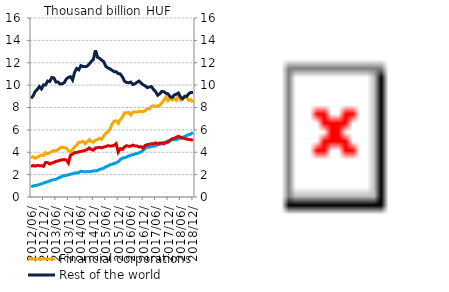
| Category | Financial corporations | Households |
|---|---|---|
| 2012-06-30 | 3.522 | 0.913 |
| 2012-07-31 | 3.581 | 0.984 |
| 2012-08-31 | 3.45 | 1.023 |
| 2012-09-30 | 3.547 | 1.06 |
| 2012-10-31 | 3.66 | 1.107 |
| 2012-11-30 | 3.762 | 1.168 |
| 2012-12-31 | 3.703 | 1.246 |
| 2013-01-31 | 3.965 | 1.311 |
| 2013-02-28 | 3.854 | 1.364 |
| 2013-03-31 | 3.951 | 1.436 |
| 2013-04-30 | 4.077 | 1.516 |
| 2013-05-31 | 4.152 | 1.541 |
| 2013-06-30 | 4.122 | 1.58 |
| 2013-07-31 | 4.225 | 1.681 |
| 2013-08-31 | 4.38 | 1.75 |
| 2013-09-30 | 4.46 | 1.872 |
| 2013-10-31 | 4.414 | 1.893 |
| 2013-11-30 | 4.366 | 1.935 |
| 2013-12-31 | 4.145 | 1.991 |
| 2014-01-31 | 4.032 | 2.036 |
| 2014-02-28 | 4.224 | 2.07 |
| 2014-03-31 | 4.491 | 2.148 |
| 2014-04-30 | 4.631 | 2.151 |
| 2014-05-31 | 4.888 | 2.186 |
| 2014-06-30 | 4.883 | 2.301 |
| 2014-07-31 | 4.984 | 2.265 |
| 2014-08-31 | 4.755 | 2.248 |
| 2014-09-30 | 4.91 | 2.27 |
| 2014-10-31 | 5.11 | 2.262 |
| 2014-11-30 | 4.966 | 2.287 |
| 2014-12-31 | 4.888 | 2.333 |
| 2015-01-31 | 5.077 | 2.336 |
| 2015-02-28 | 5.129 | 2.364 |
| 2015-03-31 | 5.259 | 2.472 |
| 2015-04-30 | 5.15 | 2.514 |
| 2015-05-31 | 5.437 | 2.57 |
| 2015-06-30 | 5.703 | 2.704 |
| 2015-07-31 | 5.799 | 2.766 |
| 2015-08-31 | 6.047 | 2.879 |
| 2015-09-30 | 6.487 | 2.922 |
| 2015-10-31 | 6.783 | 2.995 |
| 2015-11-30 | 6.806 | 3.051 |
| 2015-12-31 | 6.583 | 3.16 |
| 2016-01-31 | 6.924 | 3.34 |
| 2016-02-29 | 7.136 | 3.482 |
| 2016-03-31 | 7.526 | 3.506 |
| 2016-04-30 | 7.517 | 3.568 |
| 2016-05-31 | 7.568 | 3.667 |
| 2016-06-30 | 7.337 | 3.726 |
| 2016-07-31 | 7.579 | 3.779 |
| 2016-08-31 | 7.612 | 3.836 |
| 2016-09-30 | 7.589 | 3.888 |
| 2016-10-31 | 7.655 | 3.95 |
| 2016-11-30 | 7.646 | 4.034 |
| 2016-12-31 | 7.618 | 4.179 |
| 2017-01-31 | 7.727 | 4.344 |
| 2017-02-28 | 7.889 | 4.469 |
| 2017-03-31 | 7.879 | 4.451 |
| 2017-04-30 | 8.097 | 4.52 |
| 2017-05-31 | 8.164 | 4.543 |
| 2017-06-30 | 8.095 | 4.566 |
| 2017-07-31 | 8.135 | 4.683 |
| 2017-08-31 | 8.206 | 4.698 |
| 2017-09-30 | 8.405 | 4.767 |
| 2017-10-31 | 8.643 | 4.874 |
| 2017-11-30 | 8.949 | 4.902 |
| 2017-12-31 | 8.613 | 5.025 |
| 2018-01-31 | 8.768 | 5.04 |
| 2018-02-28 | 8.688 | 5.098 |
| 2018-03-31 | 8.833 | 5.132 |
| 2018-04-30 | 8.649 | 5.14 |
| 2018-05-31 | 9.028 | 5.208 |
| 2018-06-30 | 8.647 | 5.282 |
| 2018-07-31 | 8.762 | 5.324 |
| 2018-08-31 | 8.959 | 5.411 |
| 2018-09-30 | 8.866 | 5.484 |
| 2018-10-31 | 8.635 | 5.588 |
| 2018-11-30 | 8.7 | 5.625 |
| 2018-12-31 | 8.467 | 5.779 |